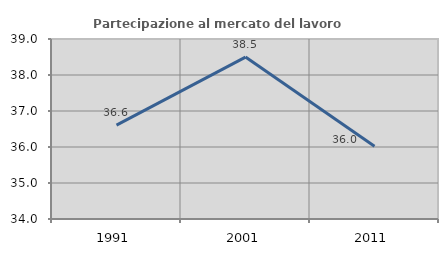
| Category | Partecipazione al mercato del lavoro  femminile |
|---|---|
| 1991.0 | 36.609 |
| 2001.0 | 38.498 |
| 2011.0 | 36.019 |